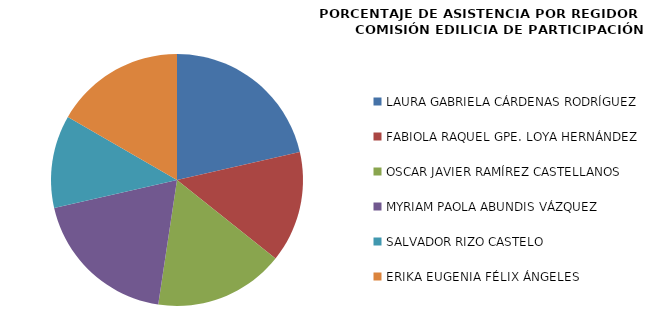
| Category | Series 0 |
|---|---|
| LAURA GABRIELA CÁRDENAS RODRÍGUEZ | 100 |
| FABIOLA RAQUEL GPE. LOYA HERNÁNDEZ | 66.667 |
| OSCAR JAVIER RAMÍREZ CASTELLANOS | 77.778 |
| MYRIAM PAOLA ABUNDIS VÁZQUEZ | 88.889 |
| SALVADOR RIZO CASTELO | 55.556 |
| ERIKA EUGENIA FÉLIX ÁNGELES | 77.778 |